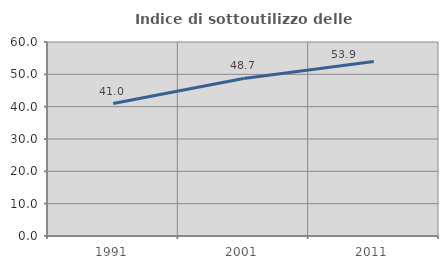
| Category | Indice di sottoutilizzo delle abitazioni  |
|---|---|
| 1991.0 | 40.956 |
| 2001.0 | 48.738 |
| 2011.0 | 53.947 |